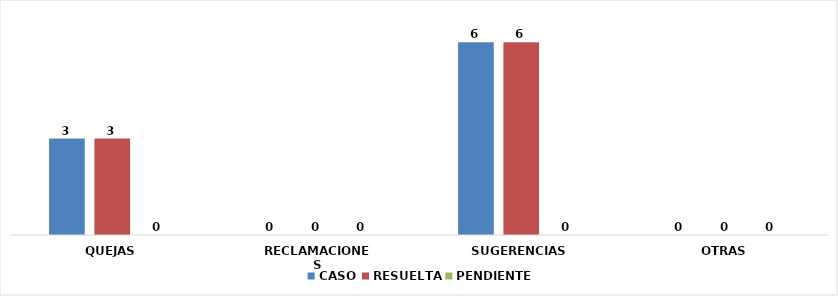
| Category | CASO | RESUELTA | PENDIENTE |
|---|---|---|---|
| QUEJAS | 3 | 3 | 0 |
| RECLAMACIONES | 0 | 0 | 0 |
| SUGERENCIAS | 6 | 6 | 0 |
| OTRAS | 0 | 0 | 0 |